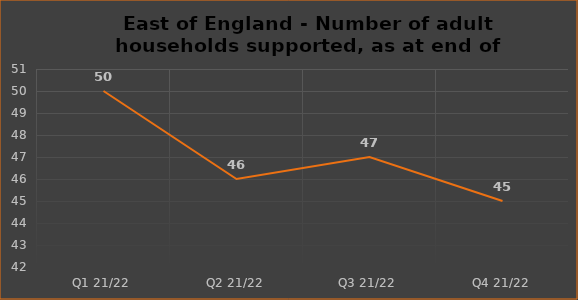
| Category | Number of financially supported households at end of quarter |
|---|---|
| Q1 21/22 | 50 |
| Q2 21/22 | 46 |
| Q3 21/22 | 47 |
| Q4 21/22 | 45 |